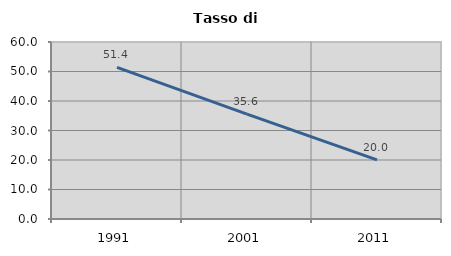
| Category | Tasso di disoccupazione   |
|---|---|
| 1991.0 | 51.392 |
| 2001.0 | 35.559 |
| 2011.0 | 20.037 |